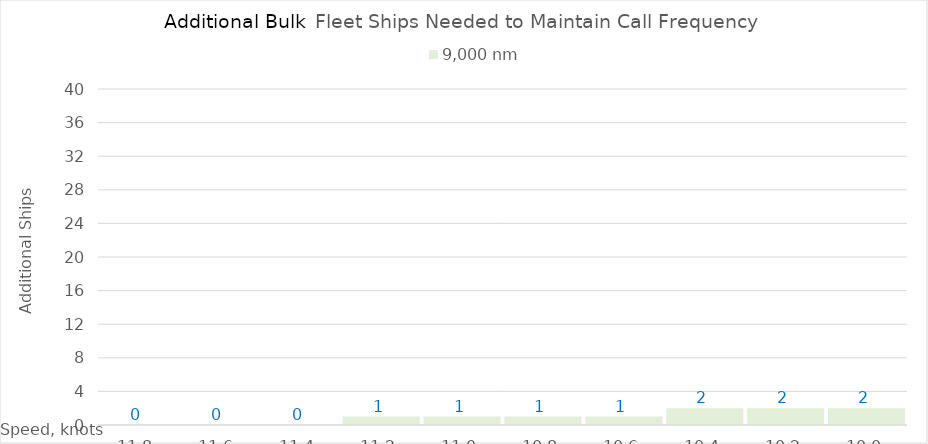
| Category | 9,000 |
|---|---|
| 11.8 | 0 |
| 11.600000000000001 | 0 |
| 11.400000000000002 | 0 |
| 11.200000000000003 | 1 |
| 11.000000000000004 | 1 |
| 10.800000000000004 | 1 |
| 10.600000000000005 | 1 |
| 10.400000000000006 | 2 |
| 10.200000000000006 | 2 |
| 10.000000000000007 | 2 |